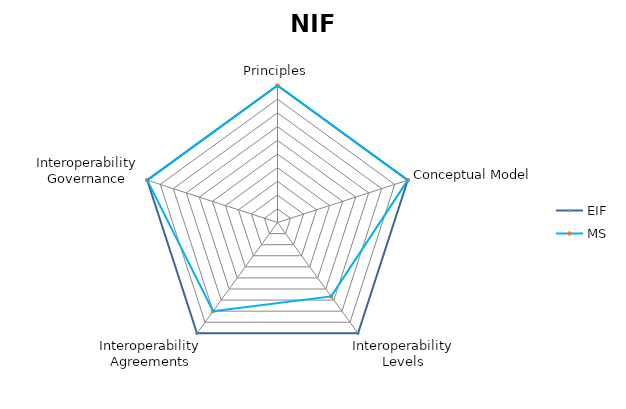
| Category | EIF | MS |
|---|---|---|
| Principles | 1 | 1 |
| Conceptual Model | 1 | 1 |
| Interoperability Levels | 1 | 0.667 |
| Interoperability Agreements | 1 | 0.8 |
| Interoperability Governance | 1 | 1 |